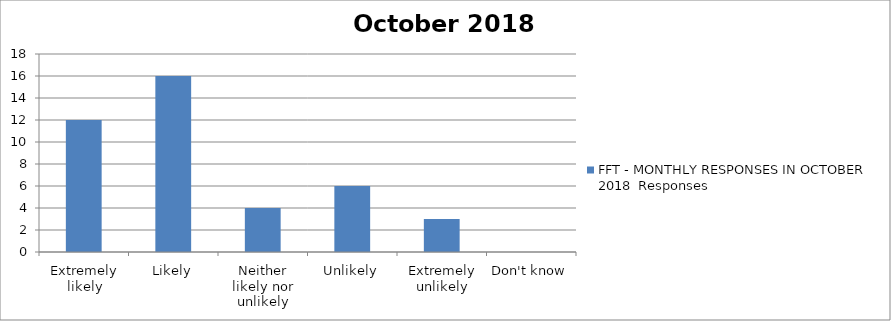
| Category | FFT - MONTHLY RESPONSES IN OCTOBER 2018 Responses |
|---|---|
| Extremely likely | 12 |
| Likely | 16 |
| Neither likely nor unlikely | 4 |
| Unlikely | 6 |
| Extremely unlikely | 3 |
| Don't know | 0 |